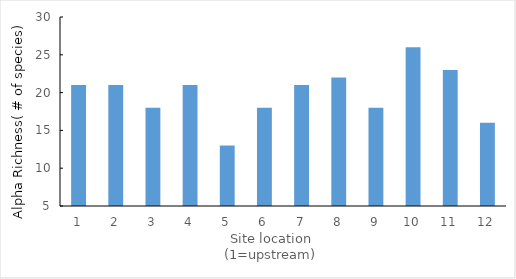
| Category | Series 0 |
|---|---|
| 0 | 21 |
| 1 | 21 |
| 2 | 18 |
| 3 | 21 |
| 4 | 13 |
| 5 | 18 |
| 6 | 21 |
| 7 | 22 |
| 8 | 18 |
| 9 | 26 |
| 10 | 23 |
| 11 | 16 |